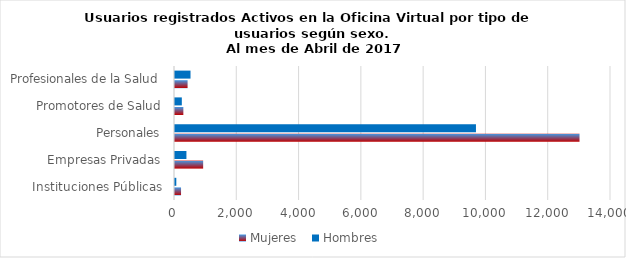
| Category | Mujeres | Hombres |
|---|---|---|
| Instituciones Públicas | 194 | 42 |
| Empresas Privadas | 904 | 367 |
| Personales | 12989 | 9664 |
| Promotores de Salud | 268 | 219 |
| Profesionales de la Salud | 404 | 498 |